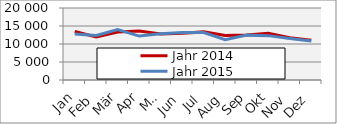
| Category | Jahr 2014 | Jahr 2015 |
|---|---|---|
| 0 | 13467.504 | 12772.651 |
| 1 | 11952.959 | 12344.729 |
| 2 | 13326.8 | 13979.47 |
| 3 | 13613.541 | 12202.716 |
| 4 | 12787.858 | 12817.194 |
| 5 | 12988.875 | 13220.23 |
| 6 | 13366.47 | 13184.563 |
| 7 | 12342.11 | 11185.869 |
| 8 | 12520.678 | 12464.842 |
| 9 | 13008.925 | 12325.276 |
| 10 | 11736.257 | 11525.447 |
| 11 | 11045.203 | 10811.125 |